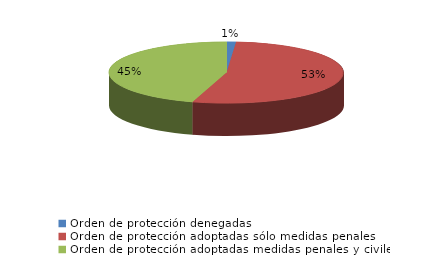
| Category | Series 0 |
|---|---|
| Orden de protección denegadas | 6 |
| Orden de protección adoptadas sólo medidas penales | 247 |
| Orden de protección adoptadas medidas penales y civiles | 210 |